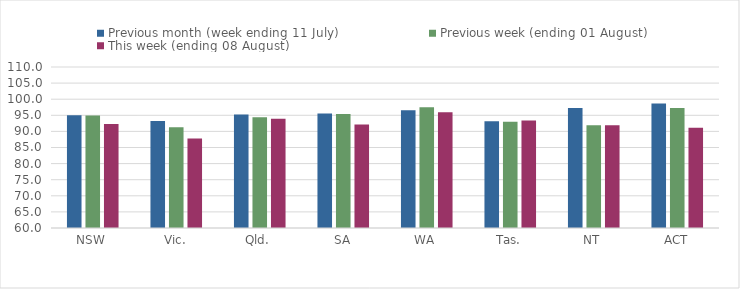
| Category | Previous month (week ending 11 July) | Previous week (ending 01 August) | This week (ending 08 August) |
|---|---|---|---|
| NSW | 95.043 | 94.924 | 92.299 |
| Vic. | 93.245 | 91.299 | 87.82 |
| Qld. | 95.24 | 94.362 | 93.924 |
| SA | 95.569 | 95.427 | 92.177 |
| WA | 96.583 | 97.482 | 95.966 |
| Tas. | 93.163 | 93.004 | 93.373 |
| NT | 97.292 | 91.922 | 91.92 |
| ACT | 98.627 | 97.285 | 91.128 |